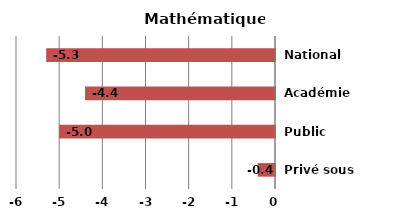
| Category | Ecart |
|---|---|
| Privé sous contrat | -0.4 |
| Public | -5 |
| Académie | -4.4 |
| National | -5.3 |